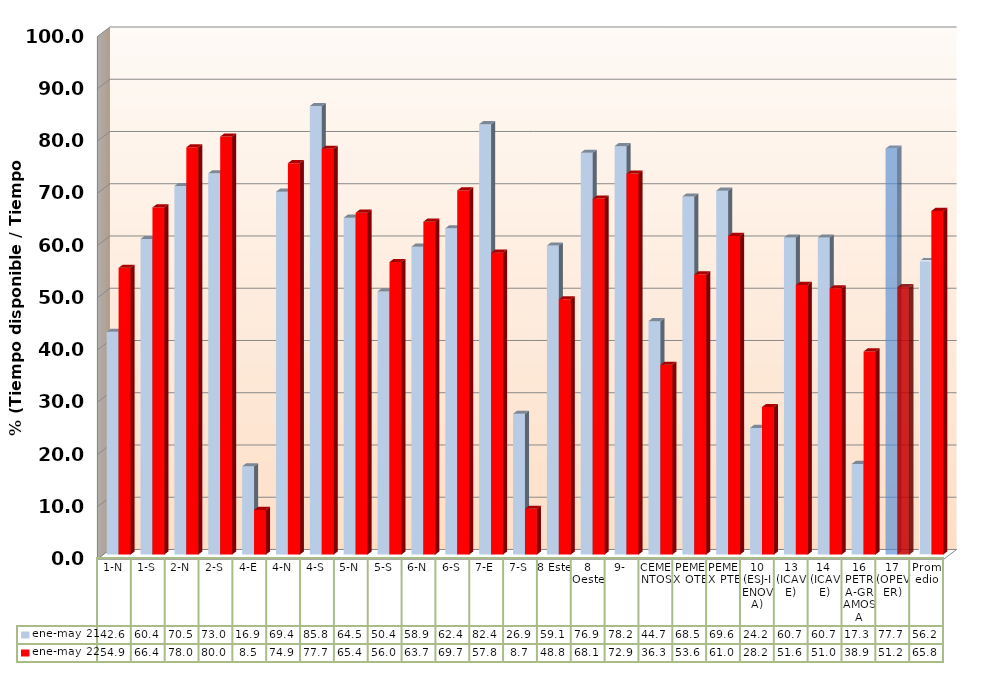
| Category | ene-may 21 | ene-may 22 |
|---|---|---|
| 1-N | 42.617 | 54.874 |
| 1-S | 60.397 | 66.432 |
| 2-N | 70.521 | 77.951 |
| 2-S | 72.972 | 80 |
| 4-E | 16.893 | 8.541 |
| 4-N | 69.443 | 74.91 |
| 4-S | 85.849 | 77.662 |
| 5-N | 64.478 | 65.428 |
| 5-S | 50.363 | 55.99 |
| 6-N | 58.926 | 63.702 |
| 6-S | 62.448 | 69.689 |
| 7-E | 82.375 | 57.782 |
| 7-S | 26.942 | 8.748 |
| 8 Este | 59.148 | 48.839 |
| 8 Oeste | 76.905 | 68.121 |
| 9- | 78.166 | 72.904 |
| CEMENTOS | 44.673 | 36.324 |
| PEMEX OTE | 68.522 | 53.615 |
| PEMEX PTE | 69.644 | 60.975 |
| 10 (ESJ-IENOVA) | 24.234 | 28.231 |
| 13 (ICAVE) | 60.68 | 51.6 |
| 14  (ICAVE) | 60.68 | 50.96 |
| 16 PETRA-GRAMOSA | 17.339 | 38.871 |
| 17 (OPEVER) | 77.704 | 51.194 |
| Promedio | 56.242 | 65.763 |